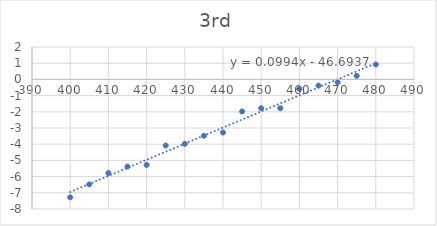
| Category | Series 0 |
|---|---|
| 400.0 | -7.28 |
| 405.0 | -6.48 |
| 410.0 | -5.78 |
| 415.0 | -5.38 |
| 420.0 | -5.28 |
| 425.0 | -4.08 |
| 430.0 | -3.98 |
| 435.0 | -3.48 |
| 440.0 | -3.28 |
| 445.0 | -1.98 |
| 450.0 | -1.78 |
| 455.0 | -1.78 |
| 460.0 | -0.58 |
| 465.0 | -0.38 |
| 470.0 | -0.18 |
| 475.0 | 0.22 |
| 480.0 | 0.92 |